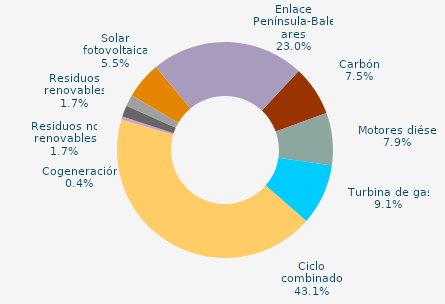
| Category | Series 0 |
|---|---|
| Carbón | 7.49 |
| Motores diésel | 7.857 |
| Turbina de gas | 9.145 |
| Ciclo combinado | 43.138 |
| Generación auxiliar | 0 |
| Cogeneración | 0.442 |
| Residuos no renovables | 1.71 |
| Residuos renovables | 1.71 |
| Eólica | 0.016 |
| Solar fotovoltaica | 5.503 |
| Otras renovables | 0.005 |
| Enlace Península-Baleares | 22.983 |